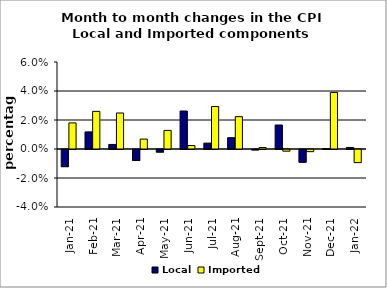
| Category | Local | Imported |
|---|---|---|
| 2021-01-01 | -0.012 | 0.018 |
| 2021-02-01 | 0.012 | 0.026 |
| 2021-03-01 | 0.003 | 0.025 |
| 2021-04-01 | -0.008 | 0.007 |
| 2021-05-01 | -0.002 | 0.013 |
| 2021-06-01 | 0.026 | 0.002 |
| 2021-07-01 | 0.004 | 0.029 |
| 2021-08-01 | 0.008 | 0.022 |
| 2021-09-01 | 0 | 0.001 |
| 2021-10-01 | 0.017 | -0.001 |
| 2021-11-01 | -0.009 | -0.001 |
| 2021-12-01 | 0 | 0.039 |
| 2022-01-01 | 0.001 | -0.009 |